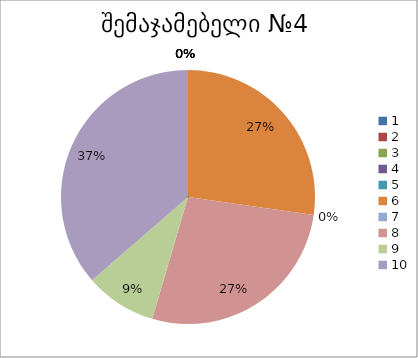
| Category | რაოდენობა | ქულა |
|---|---|---|
| 0 | 0 | 1 |
| 1 | 0 | 2 |
| 2 | 0 | 3 |
| 3 | 0 | 4 |
| 4 | 0 | 5 |
| 5 | 3 | 6 |
| 6 | 0 | 7 |
| 7 | 3 | 8 |
| 8 | 1 | 9 |
| 9 | 4 | 10 |